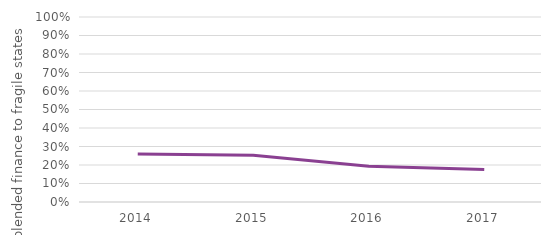
| Category | Fragile |
|---|---|
| 2014.0 | 0.26 |
| 2015.0 | 0.253 |
| 2016.0 | 0.193 |
| 2017.0 | 0.175 |